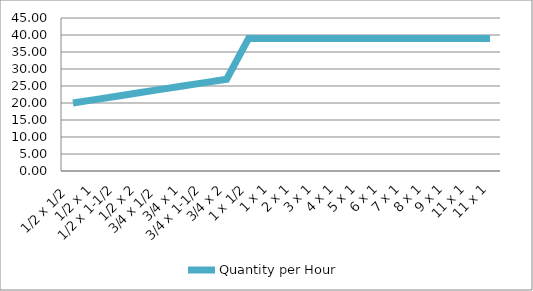
| Category | Quantity per Hour |
|---|---|
|  1/2 x 1/2 | 20 |
|  1/2 x 1 | 21 |
|  1/2 x 1-1/2 | 22 |
|  1/2 x 2 | 23 |
|  3/4 x 1/2 | 24 |
|  3/4 x 1 | 25 |
|  3/4 x 1-1/2 | 26 |
|  3/4 x 2 | 27 |
|  1 x 1/2 | 39 |
|  1 x 1 | 39 |
|  2 x 1 | 39 |
|  3 x 1 | 39 |
|  4 x 1 | 39 |
|  5 x 1 | 39 |
|  6 x 1 | 39 |
|  7 x 1 | 39 |
|  8 x 1 | 39 |
|  9 x 1 | 39 |
| 11 x 1 | 39 |
|  11 x 1 | 39 |